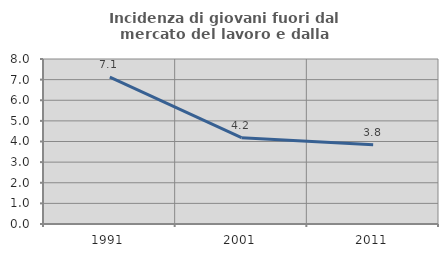
| Category | Incidenza di giovani fuori dal mercato del lavoro e dalla formazione  |
|---|---|
| 1991.0 | 7.121 |
| 2001.0 | 4.184 |
| 2011.0 | 3.846 |